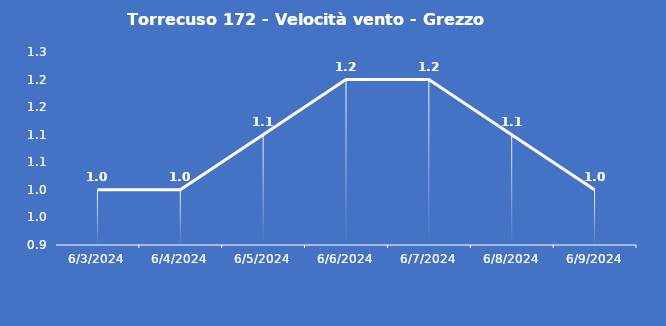
| Category | Torrecuso 172 - Velocità vento - Grezzo (m/s) |
|---|---|
| 6/3/24 | 1 |
| 6/4/24 | 1 |
| 6/5/24 | 1.1 |
| 6/6/24 | 1.2 |
| 6/7/24 | 1.2 |
| 6/8/24 | 1.1 |
| 6/9/24 | 1 |